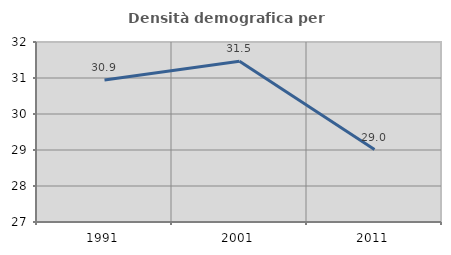
| Category | Densità demografica |
|---|---|
| 1991.0 | 30.946 |
| 2001.0 | 31.466 |
| 2011.0 | 29.012 |